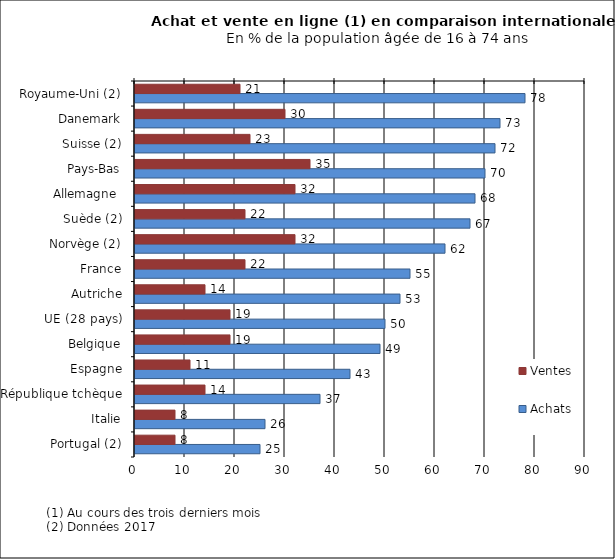
| Category | Achats | Ventes |
|---|---|---|
| Portugal (2) | 25 | 8 |
| Italie | 26 | 8 |
| République tchèque | 37 | 14 |
| Espagne | 43 | 11 |
| Belgique | 49 | 19 |
| UE (28 pays) | 50 | 19 |
| Autriche | 53 | 14 |
| France | 55 | 22 |
| Norvège (2) | 62 | 32 |
| Suède (2) | 67 | 22 |
| Allemagne  | 68 | 32 |
| Pays-Bas | 70 | 35 |
| Suisse (2) | 72 | 23 |
| Danemark | 73 | 30 |
| Royaume-Uni (2) | 78 | 21 |